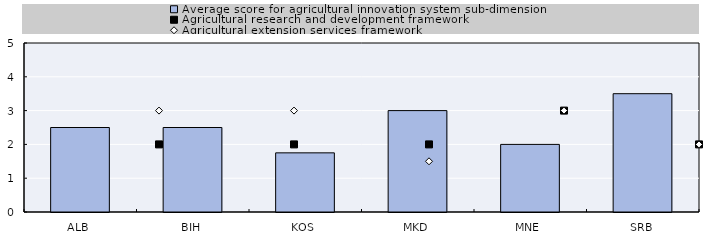
| Category | Average score for agricultural innovation system sub-dimension |
|---|---|
| ALB | 2.5 |
| BIH | 2.5 |
| KOS | 1.75 |
| MKD | 3 |
| MNE | 2 |
| SRB | 3.5 |